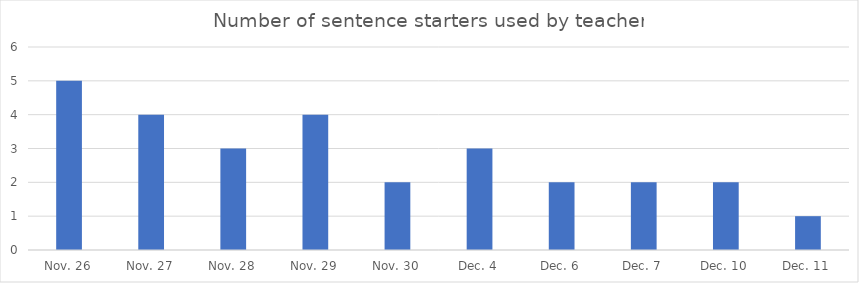
| Category | Number of sentence starters used by teacher |
|---|---|
| Nov. 26 | 5 |
| Nov. 27 | 4 |
| Nov. 28 | 3 |
| Nov. 29 | 4 |
| Nov. 30 | 2 |
| Dec. 4 | 3 |
| Dec. 6 | 2 |
| Dec. 7 | 2 |
| Dec. 10 | 2 |
| Dec. 11 | 1 |